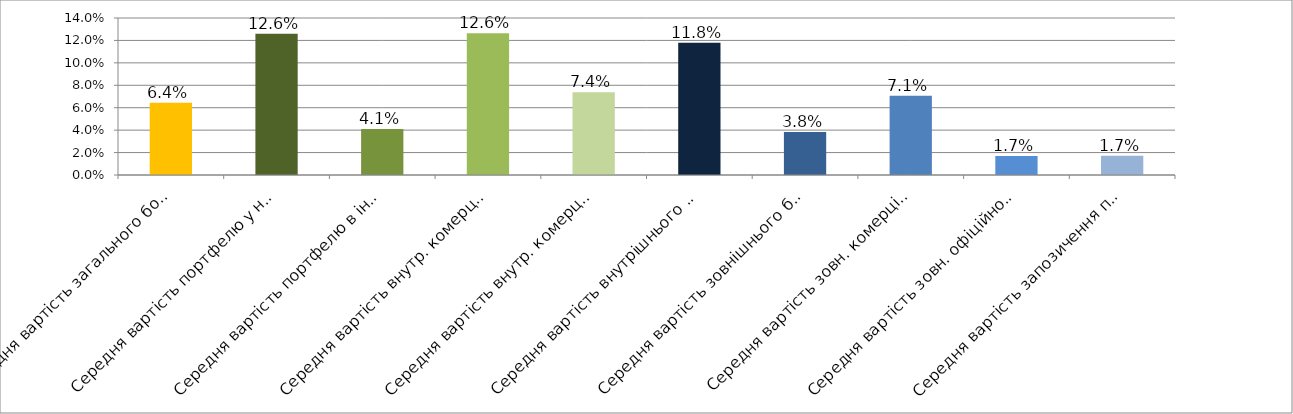
| Category | Series 0 |
|---|---|
| Середня вартість загального боргового портфелю | 0.064 |
| Середня вартість портфелю у нац.валюті | 0.126 |
| Середня вартість портфелю в іноземній валюті | 0.041 |
| Середня вартість внутр. комерційного портфелю в нац.валюті | 0.126 |
| Середня вартість внутр. комерційного портфелю в іноземній валюті | 0.074 |
| Середня вартість внутрішнього боргового портфелю | 0.118 |
| Середня вартість зовнішнього боргового портфелю | 0.038 |
| Середня вартість зовн. комерційного портфелю в іноземній валюті | 0.071 |
| Середня вартість зовн. офіційного портфелю в іноземній валюті | 0.017 |
| Середня вартість запозичення під держгарантії США в іноземній валюті | 0.017 |